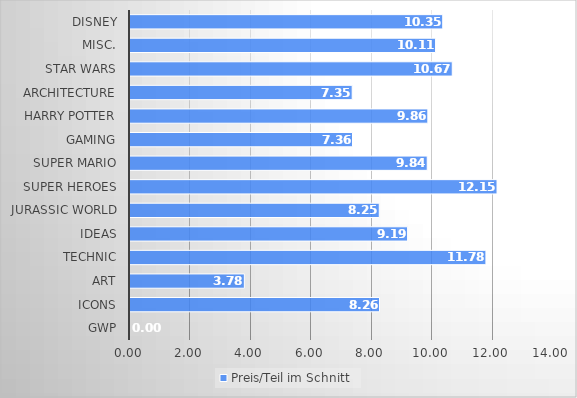
| Category | Teile Schnitt |
|---|---|
| GWP | 214.222 |
| ICONS | 2567.865 |
| Art | 3836.692 |
| Technic | 2401.375 |
| IDEAS | 2006.267 |
| Jurassic World | 1212 |
| Super Heroes | 1608.5 |
| Super Mario | 2505.667 |
| Gaming | 1222 |
| Harry Potter | 4069.5 |
| Architecture | 1452 |
| Star Wars | 1719.7 |
| Misc. | 346 |
| Disney | 1739 |